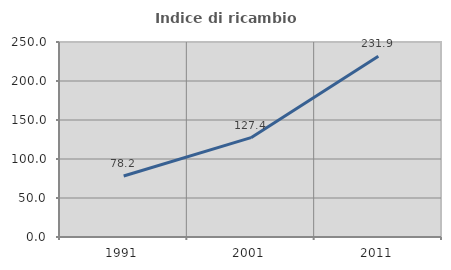
| Category | Indice di ricambio occupazionale  |
|---|---|
| 1991.0 | 78.226 |
| 2001.0 | 127.383 |
| 2011.0 | 231.85 |